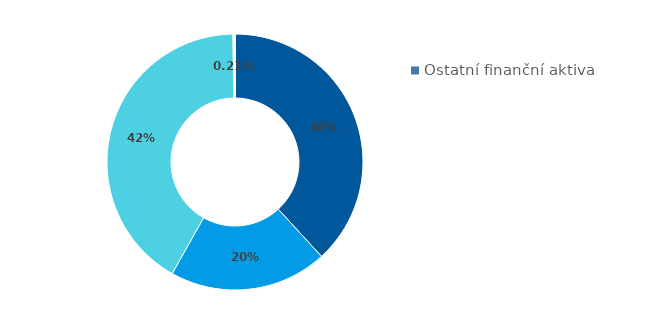
| Category | Series 0 |
|---|---|
| Hotovost | 0.382 |
| Půjčky poskytnuté nemovitostní společnosti | 0.2 |
| Majetkové účasti v nemovitostní společnosti | 0.416 |
| Ostatní finanční aktiva | 0.002 |